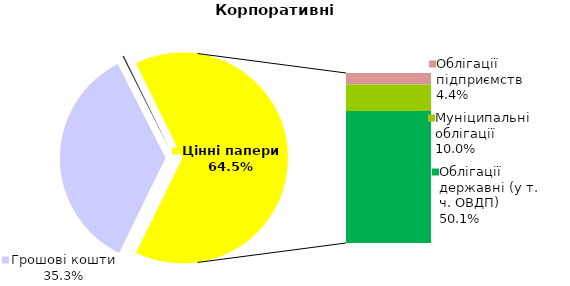
| Category | Корпоративні |
|---|---|
| Грошові кошти | 113.909 |
| Банківські метали | 0 |
| Нерухомість | 0 |
| Інші активи | 0.74 |
| Акції | 0.022 |
| Облігації підприємств | 14.2 |
| Муніципальні облігації | 32.181 |
| Облігації державні (у т. ч. ОВДП) | 161.857 |